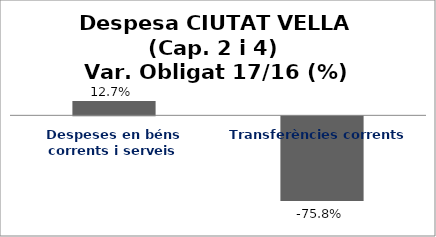
| Category | Series 0 |
|---|---|
| Despeses en béns corrents i serveis | 0.127 |
| Transferències corrents | -0.758 |